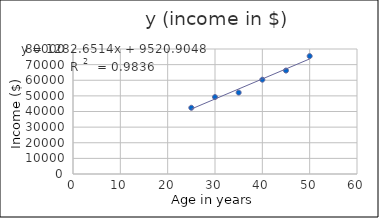
| Category | y (income in $) |
|---|---|
| 25.0 | 42388 |
| 30.0 | 49233 |
| 35.0 | 52100 |
| 40.0 | 60344 |
| 45.0 | 66213 |
| 50.0 | 75444 |